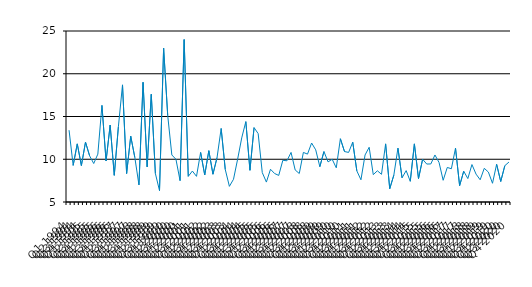
| Category | Series 0 |
|---|---|
| Q1 1994 | 13.4 |
| Q2 1994 | 9.28 |
| Q3 1994 | 11.8 |
| Q4 1994 | 9.26 |
| Q1 1995 | 12 |
| Q2 1995 | 10.4 |
| Q3 1995 | 9.5 |
| Q4 1995 | 10.6 |
| Q1 1996 | 16.3 |
| Q2 1996 | 9.8 |
| Q3 1996 | 14 |
| Q4 1996 | 8.12 |
| Q1 1997 | 13.8 |
| Q2 1997 | 18.7 |
| Q3 1997 | 8.33 |
| Q4 1997 | 12.7 |
| Q1 1998 | 10.2 |
| Q2 1998 | 7 |
| Q3 1998 | 19 |
| Q4 1998 | 9.11 |
| Q1 1999 | 17.6 |
| Q2 1999 | 8.33 |
| Q3 1999 | 6.33 |
| Q4 1999 | 23 |
| Q1 2000 | 15.1 |
| Q2 2000 | 10.5 |
| Q3 2000 | 10 |
| Q4 2000 | 7.5 |
| Q1 2001 | 24 |
| Q2 2001 | 8 |
| Q3 2001 | 8.62 |
| Q4 2001 | 8 |
| Q1 2002 | 10.8 |
| Q2 2002 | 8.16 |
| Q3 2002 | 11 |
| Q4 2002 | 8.25 |
| Q1 2003 | 10.2 |
| Q2 2003 | 13.6 |
| Q3 2003 | 8.8 |
| Q4 2003 | 6.83 |
| Q1 2004 | 7.66 |
| Q2 2004 | 10 |
| Q3 2004 | 12.5 |
| Q4 2004 | 14.4 |
| Q1 2005 | 8.71 |
| Q2 2005 | 13.7 |
| Q3 2005 | 13 |
| Q4 2005 | 8.44 |
| Q1 2006 | 7.33 |
| Q2 2006 | 8.83 |
| Q3 2006 | 8.33 |
| Q4 2006 | 8.11 |
| Q1 2007 | 9.88 |
| Q2 2007 | 9.82 |
| Q3 2007 | 10.8 |
| Q4 2007 | 8.75 |
| Q1 2008 | 8.33 |
| Q2 2008 | 10.8 |
| Q3 2008 | 10.6 |
| Q4 2008 | 11.9 |
| Q1 2009 | 11.1 |
| Q2 2009 | 9.13 |
| Q3 2009 | 10.9 |
| Q4 2009 | 9.69 |
| Q1 2010 | 10 |
| Q2 2010 | 9 |
| Q3 2010 | 12.4 |
| Q4 2010 | 10.9 |
| Q1 2011 | 10.8 |
| Q2 2011 | 12 |
| Q3 2011 | 8.64 |
| Q4 2011 | 7.6 |
| Q1 2012 | 10.5 |
| Q2 2012 | 11.4 |
| Q3 2012 | 8.2 |
| Q4 2012 | 8.65 |
| Q1 2013 | 8.24 |
| Q2 2013 | 11.8 |
| Q3 2013 | 6.55 |
| Q4 2013 | 8.14 |
| Q1 2014 | 11.3 |
| Q2 2014 | 7.83 |
| Q3 2014 | 8.67 |
| Q4 2014 | 7.42 |
| Q1 2015 | 11.8 |
| Q2 2015 | 7.74 |
| Q3 2015 | 10 |
| Q4 2015 | 9.44 |
| Q1 2016 | 9.45 |
| Q2 2016 | 10.5 |
| Q3 2016 | 9.62 |
| Q4 2016 | 7.54 |
| Q1 2017 | 9.04 |
| Q2 2017 | 8.89 |
| Q3 2017 | 11.3 |
| Q4 2017 | 6.91 |
| Q1 2018 | 8.6 |
| Q2 2018 | 7.74 |
| Q3 2018 | 9.38 |
| Q4 2018 | 8.26 |
| Q1 2019 | 7.6 |
| Q2 2019 | 8.941 |
| Q3 2019 | 8.5 |
| Q4 2019 | 7.19 |
| Q1 2020 | 9.41 |
| Q2 2020 | 7.4 |
| Q3 2020 | 9.25 |
| Q4 2020 | 9.67 |